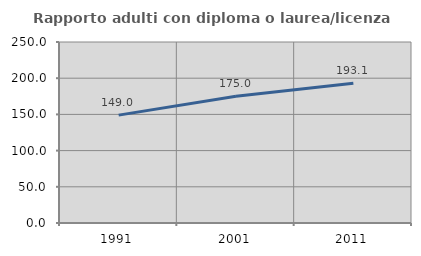
| Category | Rapporto adulti con diploma o laurea/licenza media  |
|---|---|
| 1991.0 | 148.98 |
| 2001.0 | 175 |
| 2011.0 | 193.056 |